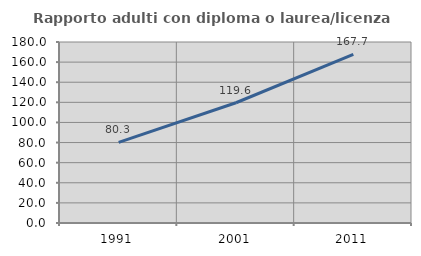
| Category | Rapporto adulti con diploma o laurea/licenza media  |
|---|---|
| 1991.0 | 80.253 |
| 2001.0 | 119.58 |
| 2011.0 | 167.665 |